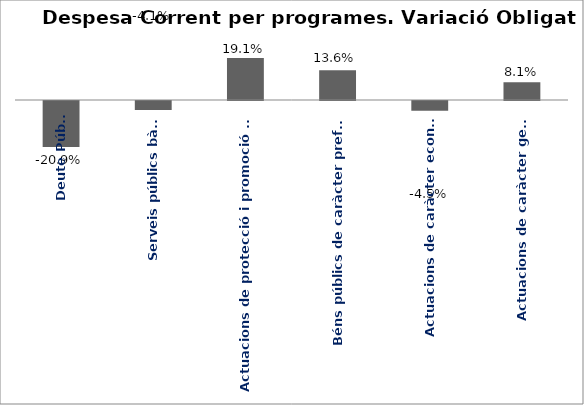
| Category | Series 0 |
|---|---|
| Deute Públic | -0.209 |
| Serveis públics bàsics | -0.041 |
| Actuacions de protecció i promoció social | 0.191 |
| Béns públics de caràcter preferent | 0.136 |
| Actuacions de caràcter econòmic | -0.045 |
| Actuacions de caràcter general | 0.081 |